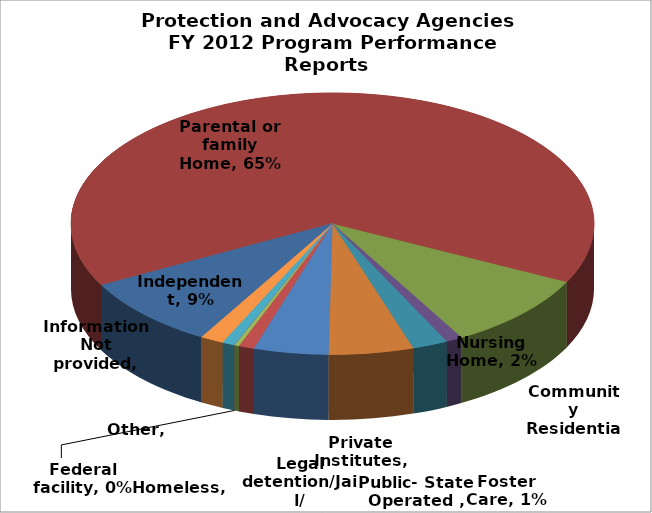
| Category | Series 0 |
|---|---|
| Independent | 0.088 |
| Parental or family Home | 0.652 |
| Community Residential Homes | 0.094 |
| Foster Care | 0.01 |
| Nursing Home | 0.022 |
| Public- State Operated  | 0.052 |
| Private Institutes | 0.046 |
| Legal detention/Jail/Prison | 0.01 |
| Homeless | 0.003 |
| Federal facility  | 0 |
| Other | 0.008 |
| Information Not provided | 0.014 |